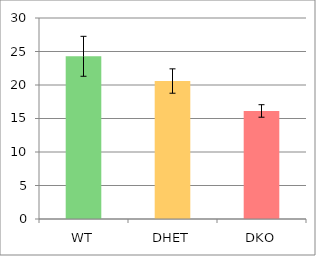
| Category | Series 0 |
|---|---|
| WT | 24.284 |
| DHET | 20.59 |
| DKO | 16.126 |